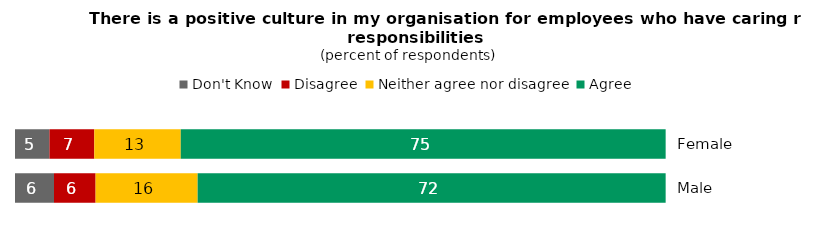
| Category | Don't Know | Disagree | Neither agree nor disagree | Agree |
|---|---|---|---|---|
| Female | 5.3 | 6.9 | 13.3 | 74.6 |
| Male | 6 | 6.4 | 15.7 | 72 |